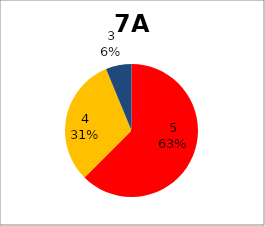
| Category | Series 0 |
|---|---|
| 5.0 | 10 |
| 4.0 | 5 |
| 3.0 | 1 |